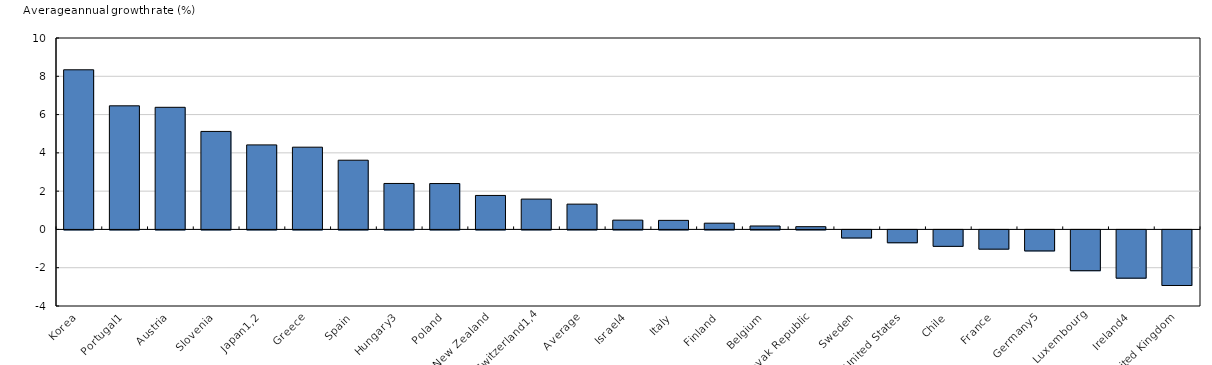
| Category | Average annual growth rate |
|---|---|
| Korea | 8.34 |
| Portugal1 | 6.457 |
| Austria | 6.38 |
| Slovenia | 5.119 |
| Japan1,2 | 4.415 |
| Greece | 4.297 |
| Spain | 3.616 |
| Hungary3 | 2.402 |
| Poland | 2.396 |
| New Zealand | 1.775 |
| Switzerland1,4 | 1.585 |
| Average | 1.321 |
| Israel4 | 0.486 |
| Italy | 0.474 |
| Finland | 0.327 |
| Belgium | 0.18 |
| Slovak Republic | 0.144 |
| Sweden | -0.421 |
| United States | -0.67 |
| Chile | -0.858 |
| France | -1.004 |
| Germany5 | -1.097 |
| Luxembourg | -2.13 |
| Ireland4 | -2.519 |
| United Kingdom | -2.903 |